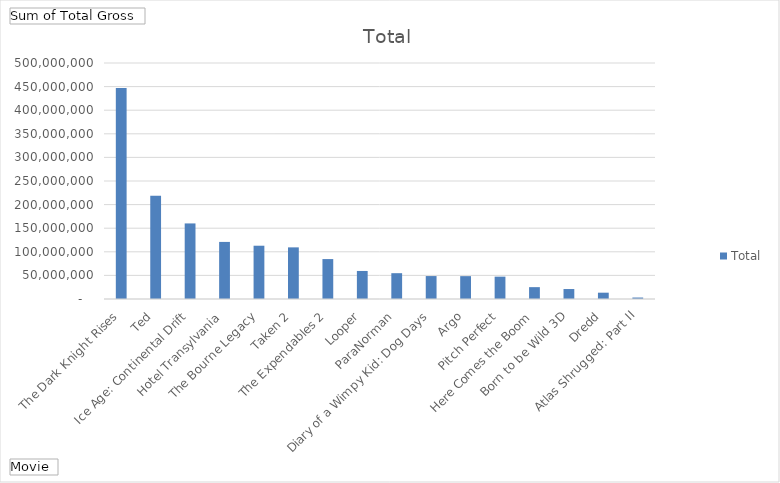
| Category | Total |
|---|---|
| The Dark Knight Rises | 446894498 |
| Ted | 218665740 |
| Ice Age: Continental Drift | 160114985 |
| Hotel Transylvania | 120936341 |
| The Bourne Legacy | 112870105 |
| Taken 2 | 109388845 |
| The Expendables 2 | 84592458 |
| Looper | 59413306 |
| ParaNorman | 54689530 |
| Diary of a Wimpy Kid: Dog Days | 48594075 |
| Argo | 48425288 |
| Pitch Perfect | 47352233 |
| Here Comes the Boom | 25110472 |
| Born to be Wild 3D | 21113708 |
| Dredd | 13380022 |
| Atlas Shrugged: Part II | 3113139 |